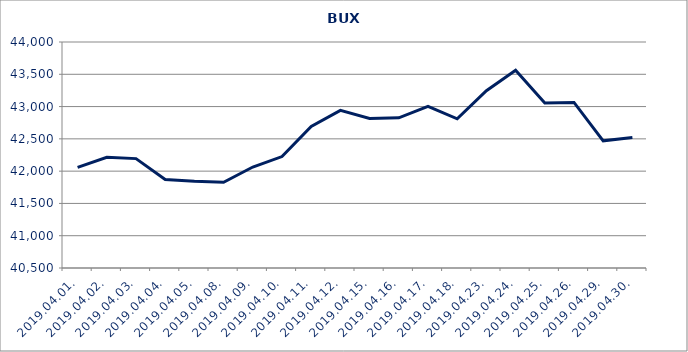
| Category | Series 0 |
|---|---|
| 2019.04.01. | 42057.333 |
| 2019.04.02. | 42213.346 |
| 2019.04.03. | 42193.967 |
| 2019.04.04. | 41870.438 |
| 2019.04.05. | 41841.921 |
| 2019.04.08. | 41826.902 |
| 2019.04.09. | 42063.939 |
| 2019.04.10. | 42225.867 |
| 2019.04.11. | 42693.515 |
| 2019.04.12. | 42940.74 |
| 2019.04.15. | 42815.922 |
| 2019.04.16. | 42826.299 |
| 2019.04.17. | 43004.506 |
| 2019.04.18. | 42810.106 |
| 2019.04.23. | 43245.434 |
| 2019.04.24. | 43563.383 |
| 2019.04.25. | 43053.87 |
| 2019.04.26. | 43064.395 |
| 2019.04.29. | 42469.842 |
| 2019.04.30. | 42520.113 |